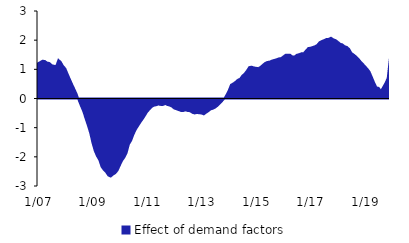
| Category | Effect of demand factors |
|---|---|
|  1/07 | 1.206 |
| 2 | 1.249 |
| 3 | 1.295 |
| 4 | 1.285 |
| 5 | 1.231 |
| 6 | 1.216 |
| 7 | 1.143 |
| 8 | 1.121 |
| 9 | 1.107 |
| 10 | 1.321 |
| 11 | 1.253 |
| 12 | 1.114 |
|  1/08 | 1.03 |
| 2 | 0.843 |
| 3 | 0.665 |
| 4 | 0.489 |
| 5 | 0.324 |
| 6 | 0.152 |
| 7 | -0.074 |
| 8 | -0.265 |
| 9 | -0.451 |
| 10 | -0.696 |
| 11 | -0.928 |
| 12 | -1.181 |
|  1/09 | -1.522 |
| 2 | -1.794 |
| 3 | -1.974 |
| 4 | -2.106 |
| 5 | -2.339 |
| 6 | -2.446 |
| 7 | -2.527 |
| 8 | -2.64 |
| 9 | -2.674 |
| 10 | -2.61 |
| 11 | -2.56 |
| 12 | -2.468 |
|  1/10 | -2.295 |
| 2 | -2.132 |
| 3 | -2.019 |
| 4 | -1.866 |
| 5 | -1.569 |
| 6 | -1.441 |
| 7 | -1.235 |
| 8 | -1.066 |
| 9 | -0.945 |
| 10 | -0.822 |
| 11 | -0.711 |
| 12 | -0.592 |
|  1/11 | -0.463 |
| 2 | -0.376 |
| 3 | -0.291 |
| 4 | -0.247 |
| 5 | -0.23 |
| 6 | -0.206 |
| 7 | -0.22 |
| 8 | -0.221 |
| 9 | -0.186 |
| 10 | -0.221 |
| 11 | -0.241 |
| 12 | -0.279 |
|  1/12 | -0.342 |
| 2 | -0.369 |
| 3 | -0.397 |
| 4 | -0.427 |
| 5 | -0.427 |
| 6 | -0.405 |
| 7 | -0.431 |
| 8 | -0.435 |
| 9 | -0.49 |
| 10 | -0.513 |
| 11 | -0.494 |
| 12 | -0.507 |
|  1/13 | -0.513 |
| 2 | -0.543 |
| 3 | -0.487 |
| 4 | -0.433 |
| 5 | -0.373 |
| 6 | -0.351 |
| 7 | -0.311 |
| 8 | -0.251 |
| 9 | -0.172 |
| 10 | -0.091 |
| 11 | -0.012 |
| 12 | 0.122 |
|  1/14 | 0.277 |
| 2 | 0.472 |
| 3 | 0.514 |
| 4 | 0.571 |
| 5 | 0.64 |
| 6 | 0.676 |
| 7 | 0.782 |
| 8 | 0.851 |
| 9 | 0.951 |
| 10 | 1.074 |
| 11 | 1.091 |
| 12 | 1.066 |
|  1/15 | 1.052 |
| 2 | 1.039 |
| 3 | 1.082 |
| 4 | 1.152 |
| 5 | 1.215 |
| 6 | 1.253 |
| 7 | 1.262 |
| 8 | 1.298 |
| 9 | 1.32 |
| 10 | 1.343 |
| 11 | 1.374 |
| 12 | 1.38 |
|  1/16 | 1.439 |
| 2 | 1.497 |
| 3 | 1.504 |
| 4 | 1.499 |
| 5 | 1.439 |
| 6 | 1.44 |
| 7 | 1.499 |
| 8 | 1.519 |
| 9 | 1.55 |
| 10 | 1.548 |
| 11 | 1.642 |
| 12 | 1.728 |
|  1/17 | 1.741 |
| 2 | 1.764 |
| 3 | 1.792 |
| 4 | 1.837 |
| 5 | 1.93 |
| 6 | 1.971 |
| 7 | 2.001 |
| 8 | 2.037 |
| 9 | 2.046 |
| 10 | 2.082 |
| 11 | 2.031 |
| 12 | 2.002 |
|  1/18 | 1.945 |
| 2 | 1.88 |
| 3 | 1.855 |
| 4 | 1.793 |
| 5 | 1.768 |
| 6 | 1.698 |
| 7 | 1.56 |
| 8 | 1.505 |
| 9 | 1.444 |
| 10 | 1.366 |
| 11 | 1.271 |
| 12 | 1.19 |
|  1/19 | 1.101 |
| 2 | 1.02 |
| 3 | 0.913 |
| 4 | 0.731 |
| 5 | 0.543 |
| 6 | 0.379 |
| 7 | 0.364 |
| 8 | 0.256 |
| 9 | 0.387 |
| 10 | 0.524 |
| 11 | 0.696 |
| 12 | 1.403 |